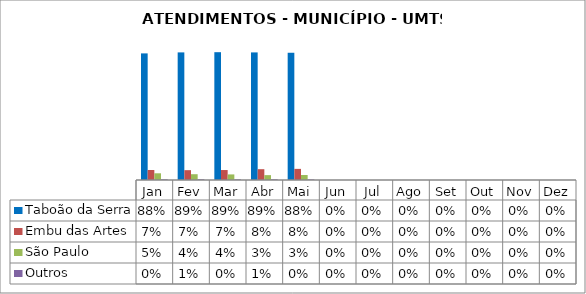
| Category | Taboão da Serra | Embu das Artes | São Paulo | Outros |
|---|---|---|---|---|
| Jan | 0.879 | 0.069 | 0.047 | 0.005 |
| Fev | 0.886 | 0.068 | 0.04 | 0.005 |
| Mar | 0.888 | 0.069 | 0.039 | 0.004 |
| Abr | 0.886 | 0.075 | 0.034 | 0.005 |
| Mai | 0.884 | 0.077 | 0.035 | 0.004 |
| Jun | 0 | 0 | 0 | 0 |
| Jul | 0 | 0 | 0 | 0 |
| Ago | 0 | 0 | 0 | 0 |
| Set | 0 | 0 | 0 | 0 |
| Out | 0 | 0 | 0 | 0 |
| Nov | 0 | 0 | 0 | 0 |
| Dez | 0 | 0 | 0 | 0 |